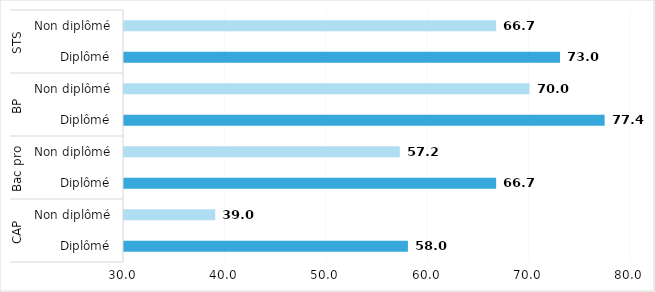
| Category | Series 0 |
|---|---|
| 0 | 58 |
| 1 | 39 |
| 2 | 66.7 |
| 3 | 57.2 |
| 4 | 77.4 |
| 5 | 70 |
| 6 | 73 |
| 7 | 66.7 |